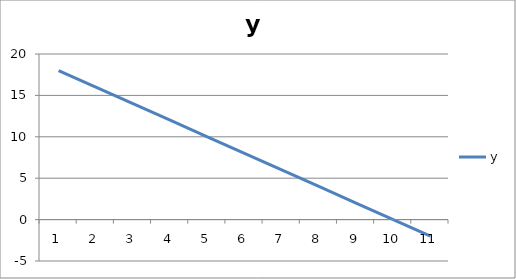
| Category | y |
|---|---|
| 0 | 18 |
| 1 | 16 |
| 2 | 14 |
| 3 | 12 |
| 4 | 10 |
| 5 | 8 |
| 6 | 6 |
| 7 | 4 |
| 8 | 2 |
| 9 | 0 |
| 10 | -2 |